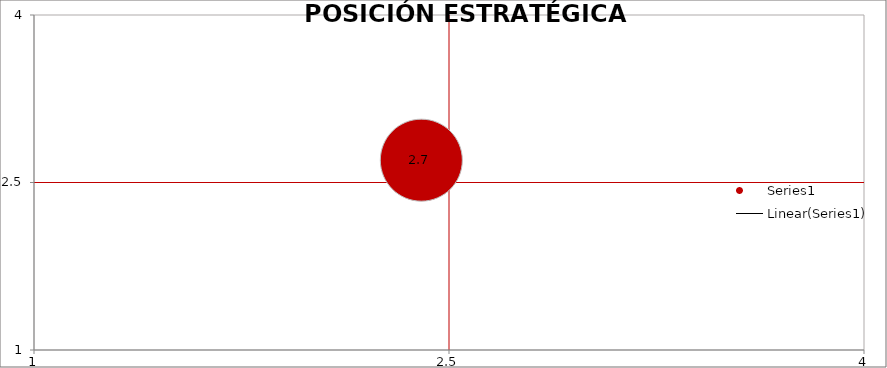
| Category | Series 0 |
|---|---|
| 2.4 | 2.7 |